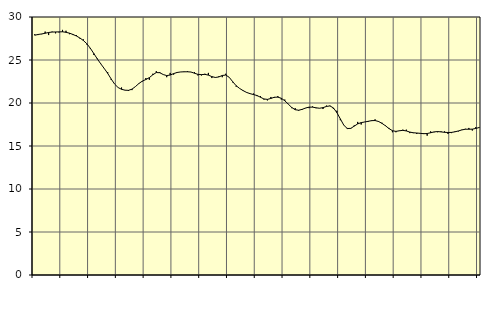
| Category | Piggar | Tillverkning o utvinning, energi o miljö, SNI 05-33, 35-39 |
|---|---|---|
| nan | 28 | 27.88 |
| 87.0 | 27.9 | 27.97 |
| 87.0 | 28 | 28.03 |
| 87.0 | 28.3 | 28.11 |
| nan | 27.9 | 28.2 |
| 88.0 | 28.3 | 28.25 |
| 88.0 | 28.1 | 28.26 |
| 88.0 | 28.2 | 28.27 |
| nan | 28.5 | 28.28 |
| 89.0 | 28.4 | 28.22 |
| 89.0 | 28 | 28.12 |
| 89.0 | 27.9 | 27.97 |
| nan | 27.9 | 27.79 |
| 90.0 | 27.5 | 27.56 |
| 90.0 | 27.4 | 27.27 |
| 90.0 | 26.8 | 26.89 |
| nan | 26.3 | 26.37 |
| 91.0 | 25.6 | 25.76 |
| 91.0 | 25.2 | 25.14 |
| 91.0 | 24.6 | 24.56 |
| nan | 24 | 24.02 |
| 92.0 | 23.6 | 23.45 |
| 92.0 | 22.7 | 22.8 |
| 92.0 | 22.2 | 22.2 |
| nan | 21.8 | 21.8 |
| 93.0 | 21.8 | 21.59 |
| 93.0 | 21.5 | 21.49 |
| 93.0 | 21.4 | 21.47 |
| nan | 21.5 | 21.61 |
| 94.0 | 21.9 | 21.91 |
| 94.0 | 22.3 | 22.27 |
| 94.0 | 22.5 | 22.55 |
| nan | 22.9 | 22.73 |
| 95.0 | 22.7 | 22.95 |
| 95.0 | 23.4 | 23.28 |
| 95.0 | 23.7 | 23.54 |
| nan | 23.6 | 23.52 |
| 96.0 | 23.3 | 23.31 |
| 96.0 | 23 | 23.19 |
| 96.0 | 23.5 | 23.25 |
| nan | 23.3 | 23.42 |
| 97.0 | 23.6 | 23.55 |
| 97.0 | 23.6 | 23.61 |
| 97.0 | 23.6 | 23.63 |
| nan | 23.7 | 23.63 |
| 98.0 | 23.6 | 23.6 |
| 98.0 | 23.6 | 23.46 |
| 98.0 | 23.2 | 23.33 |
| nan | 23.2 | 23.3 |
| 99.0 | 23.4 | 23.33 |
| 99.0 | 23.5 | 23.24 |
| 99.0 | 22.9 | 23.07 |
| nan | 23 | 22.97 |
| 0.0 | 23.1 | 23.03 |
| 0.0 | 23 | 23.2 |
| 0.0 | 23.4 | 23.25 |
| nan | 23 | 22.99 |
| 1.0 | 22.4 | 22.48 |
| 1.0 | 21.9 | 22.01 |
| 1.0 | 21.7 | 21.69 |
| nan | 21.4 | 21.44 |
| 2.0 | 21.2 | 21.23 |
| 2.0 | 21.1 | 21.09 |
| 2.0 | 21.1 | 20.98 |
| nan | 20.8 | 20.87 |
| 3.0 | 20.8 | 20.67 |
| 3.0 | 20.4 | 20.47 |
| 3.0 | 20.3 | 20.42 |
| nan | 20.7 | 20.53 |
| 4.0 | 20.6 | 20.67 |
| 4.0 | 20.8 | 20.68 |
| 4.0 | 20.4 | 20.55 |
| nan | 20.4 | 20.26 |
| 5.0 | 19.9 | 19.87 |
| 5.0 | 19.4 | 19.48 |
| 5.0 | 19.4 | 19.22 |
| nan | 19.1 | 19.16 |
| 6.0 | 19.2 | 19.26 |
| 6.0 | 19.4 | 19.42 |
| 6.0 | 19.4 | 19.52 |
| nan | 19.6 | 19.52 |
| 7.0 | 19.4 | 19.44 |
| 7.0 | 19.4 | 19.39 |
| 7.0 | 19.3 | 19.46 |
| nan | 19.7 | 19.6 |
| 8.0 | 19.7 | 19.66 |
| 8.0 | 19.3 | 19.43 |
| 8.0 | 19.1 | 18.88 |
| nan | 18 | 18.15 |
| 9.0 | 17.4 | 17.42 |
| 9.0 | 17.1 | 17.03 |
| 9.0 | 17 | 17.05 |
| nan | 17.4 | 17.31 |
| 10.0 | 17.8 | 17.57 |
| 10.0 | 17.5 | 17.72 |
| 10.0 | 17.8 | 17.79 |
| nan | 17.8 | 17.87 |
| 11.0 | 17.9 | 17.95 |
| 11.0 | 18.1 | 17.96 |
| 11.0 | 17.8 | 17.85 |
| nan | 17.7 | 17.63 |
| 12.0 | 17.4 | 17.35 |
| 12.0 | 17.1 | 17.03 |
| 12.0 | 16.6 | 16.78 |
| nan | 16.6 | 16.7 |
| 13.0 | 16.8 | 16.77 |
| 13.0 | 16.9 | 16.82 |
| 13.0 | 16.9 | 16.75 |
| nan | 16.5 | 16.62 |
| 14.0 | 16.5 | 16.54 |
| 14.0 | 16.4 | 16.51 |
| 14.0 | 16.5 | 16.47 |
| nan | 16.5 | 16.43 |
| 15.0 | 16.2 | 16.45 |
| 15.0 | 16.7 | 16.54 |
| 15.0 | 16.6 | 16.64 |
| nan | 16.6 | 16.68 |
| 16.0 | 16.7 | 16.64 |
| 16.0 | 16.7 | 16.59 |
| 16.0 | 16.4 | 16.57 |
| nan | 16.5 | 16.58 |
| 17.0 | 16.7 | 16.65 |
| 17.0 | 16.7 | 16.75 |
| 17.0 | 16.9 | 16.87 |
| nan | 17 | 16.95 |
| 18.0 | 17.1 | 16.95 |
| 18.0 | 16.8 | 16.96 |
| 18.0 | 17.2 | 17.04 |
| nan | 17.2 | 17.15 |